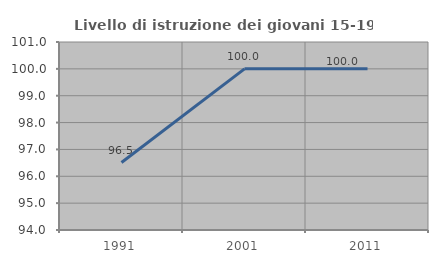
| Category | Livello di istruzione dei giovani 15-19 anni |
|---|---|
| 1991.0 | 96.512 |
| 2001.0 | 100 |
| 2011.0 | 100 |